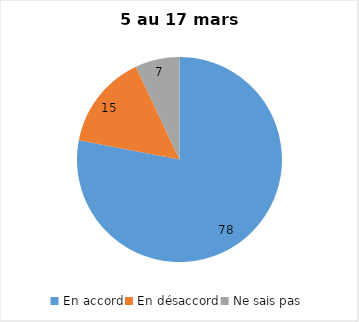
| Category | Series 0 |
|---|---|
| En accord | 78 |
| En désaccord | 15 |
| Ne sais pas | 7 |